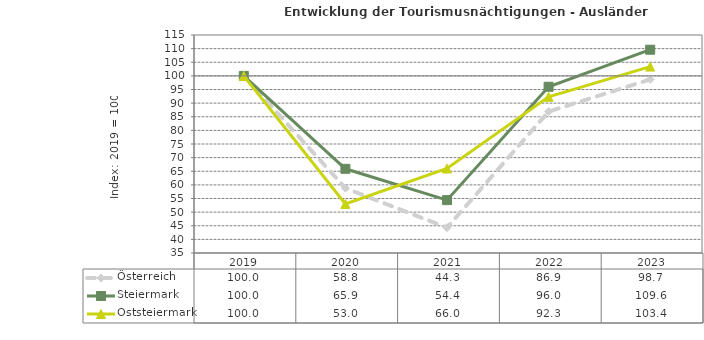
| Category | Österreich | Steiermark | Oststeiermark |
|---|---|---|---|
| 2023.0 | 98.7 | 109.6 | 103.4 |
| 2022.0 | 86.9 | 96 | 92.3 |
| 2021.0 | 44.3 | 54.4 | 66 |
| 2020.0 | 58.8 | 65.9 | 53 |
| 2019.0 | 100 | 100 | 100 |